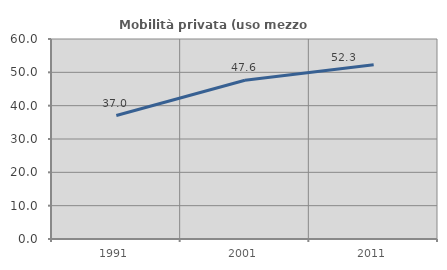
| Category | Mobilità privata (uso mezzo privato) |
|---|---|
| 1991.0 | 37.041 |
| 2001.0 | 47.61 |
| 2011.0 | 52.252 |